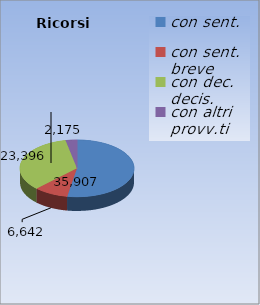
| Category | Ricorsi definiti |
|---|---|
| con sent. | 35907 |
| con sent. breve | 6642 |
| con dec. decis. | 23396 |
| con altri provv.ti | 2175 |